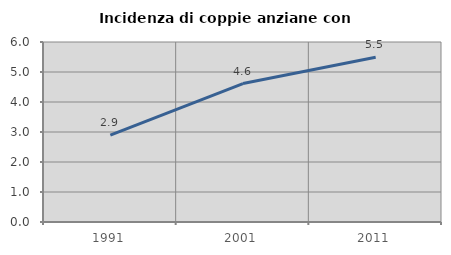
| Category | Incidenza di coppie anziane con figli |
|---|---|
| 1991.0 | 2.896 |
| 2001.0 | 4.615 |
| 2011.0 | 5.489 |